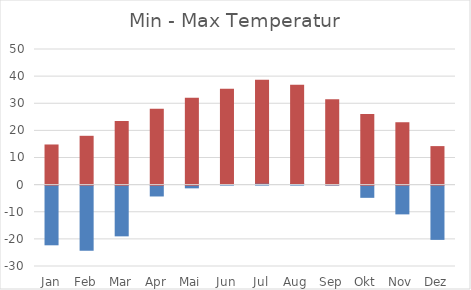
| Category | Series 0 | Series 1 | Series 2 |
|---|---|---|---|
| Jan | -22 | 0 | 14.8 |
| Feb | -24 | 0 | 18 |
| Mar | -18.7 | 0 | 23.5 |
| Apr | -4 | 0 | 28 |
| Mai | -1 | 0 | 32 |
| Jun | 0.3 | 0 | 35 |
| Jul | 0.7 | 0 | 38 |
| Aug | 0.6 | 0 | 36.2 |
| Sep | 0.1 | 0 | 31.4 |
| Okt | -4.5 | 0 | 26 |
| Nov | -10.6 | 0 | 23 |
| Dez | -20 | 0 | 14.2 |